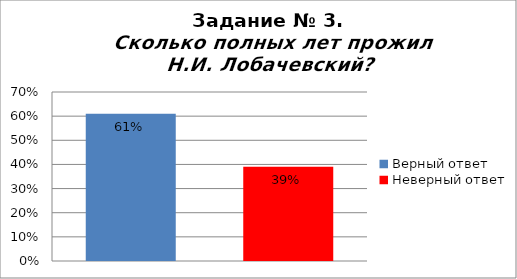
| Category | Сколько полных лет прожил Н.И. Лобачевский? |
|---|---|
| Верный ответ | 0.61 |
| Неверный ответ | 0.39 |